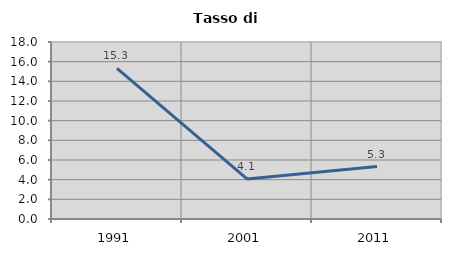
| Category | Tasso di disoccupazione   |
|---|---|
| 1991.0 | 15.311 |
| 2001.0 | 4.07 |
| 2011.0 | 5.333 |